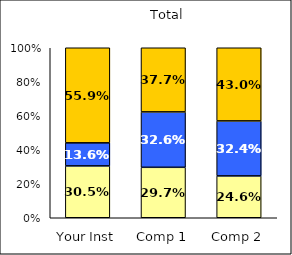
| Category | Low Respect | Average Respect | High Respect |
|---|---|---|---|
| Your Inst | 0.305 | 0.136 | 0.559 |
| Comp 1 | 0.297 | 0.326 | 0.377 |
| Comp 2 | 0.246 | 0.324 | 0.43 |